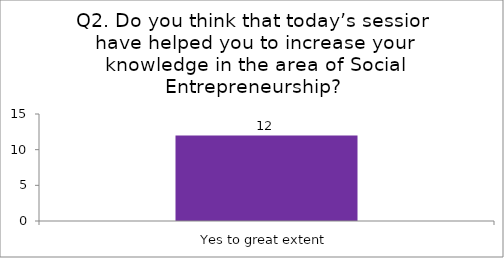
| Category | Q2. Do you think that today’s session have helped you to increase your knowledge in the area of Social Entrepreneurship? |
|---|---|
| Yes to great extent | 12 |